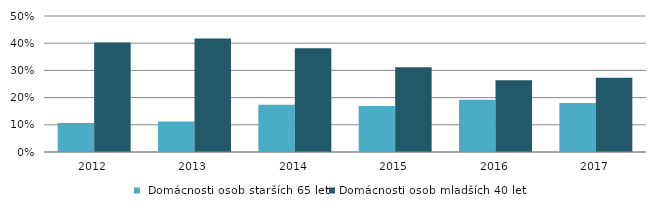
| Category |  Domácnosti osob starších 65 let | Domácnosti osob mladších 40 let |
|---|---|---|
| 2012.0 | 0.107 | 0.403 |
| 2013.0 | 0.112 | 0.417 |
| 2014.0 | 0.174 | 0.381 |
| 2015.0 | 0.169 | 0.312 |
| 2016.0 | 0.192 | 0.264 |
| 2017.0 | 0.18 | 0.273 |